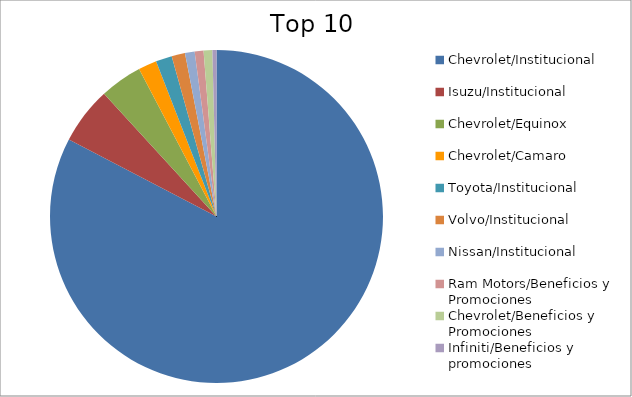
| Category | Series 0 |
|---|---|
| Chevrolet/Institucional | 81.93 |
| Isuzu/Institucional | 5.5 |
| Chevrolet/Equinox | 4.07 |
| Chevrolet/Camaro | 1.77 |
| Toyota/Institucional | 1.56 |
| Volvo/Institucional | 1.29 |
| Nissan/Institucional | 0.93 |
| Ram Motors/Beneficios y Promociones | 0.85 |
| Chevrolet/Beneficios y Promociones | 0.84 |
| Infiniti/Beneficios y promociones | 0.39 |